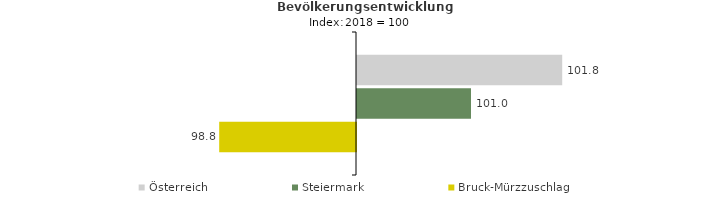
| Category | Österreich | Steiermark | Bruck-Mürzzuschlag |
|---|---|---|---|
| 2022.0 | 101.8 | 101 | 98.8 |